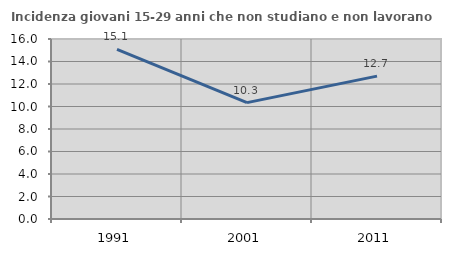
| Category | Incidenza giovani 15-29 anni che non studiano e non lavorano  |
|---|---|
| 1991.0 | 15.086 |
| 2001.0 | 10.345 |
| 2011.0 | 12.698 |